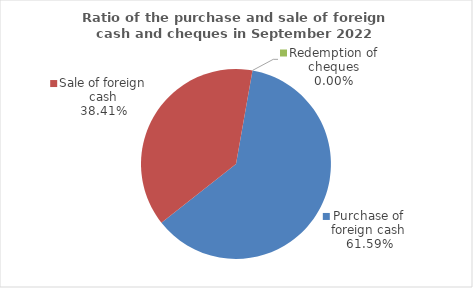
| Category | Series 0 |
|---|---|
| Purchase of foreign cash | 61.591 |
| Sale of foreign cash | 38.409 |
| Redemption of cheques | 0 |